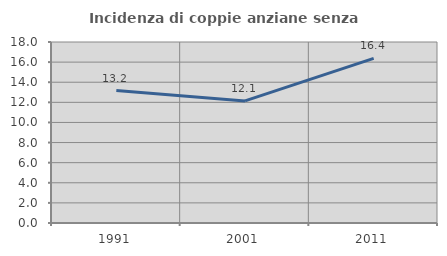
| Category | Incidenza di coppie anziane senza figli  |
|---|---|
| 1991.0 | 13.174 |
| 2001.0 | 12.139 |
| 2011.0 | 16.374 |